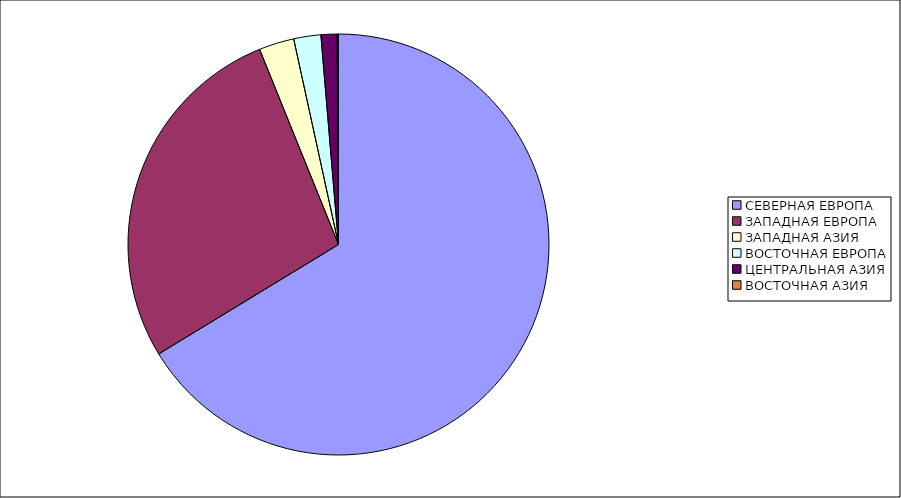
| Category | Оборот |
|---|---|
| СЕВЕРНАЯ ЕВРОПА | 66.295 |
| ЗАПАДНАЯ ЕВРОПА | 27.591 |
| ЗАПАДНАЯ АЗИЯ | 2.698 |
| ВОСТОЧНАЯ ЕВРОПА | 2.081 |
| ЦЕНТРАЛЬНАЯ АЗИЯ | 1.239 |
| ВОСТОЧНАЯ АЗИЯ | 0.097 |